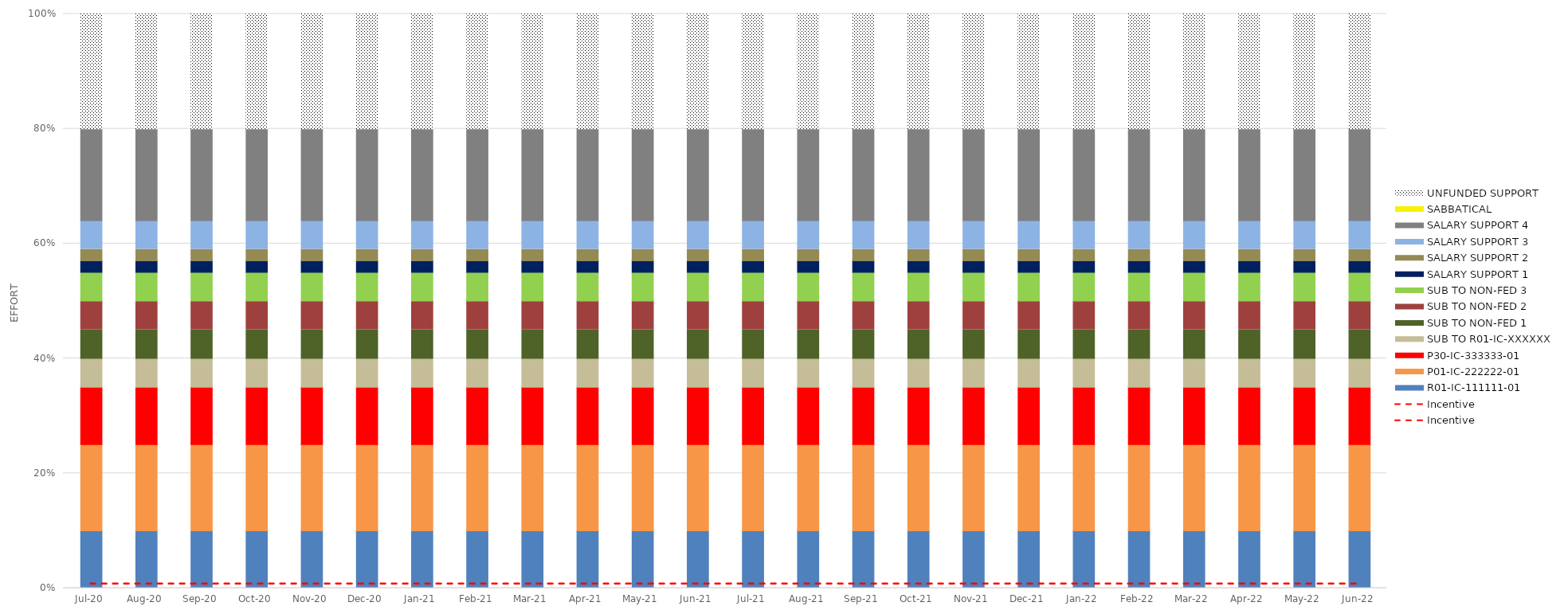
| Category | R01-IC-111111-01 | P01-IC-222222-01 | P30-IC-333333-01 | SUB TO R01-IC-XXXXXX | SUB TO NON-FED 1 | SUB TO NON-FED 2 | SUB TO NON-FED 3 | SALARY SUPPORT 1 | SALARY SUPPORT 2 | SALARY SUPPORT 3 | SALARY SUPPORT 4 | SABBATICAL | UNFUNDED SUPPORT |
|---|---|---|---|---|---|---|---|---|---|---|---|---|---|
| 2020-07-31 | 0.1 | 0.15 | 0.1 | 0.05 | 0.05 | 0.05 | 0.05 | 0.02 | 0.02 | 0.05 | 0.16 | 0 | 0.2 |
| 2020-08-31 | 0.1 | 0.15 | 0.1 | 0.05 | 0.05 | 0.05 | 0.05 | 0.02 | 0.02 | 0.05 | 0.16 | 0 | 0.2 |
| 2020-09-30 | 0.1 | 0.15 | 0.1 | 0.05 | 0.05 | 0.05 | 0.05 | 0.02 | 0.02 | 0.05 | 0.16 | 0 | 0.2 |
| 2020-10-31 | 0.1 | 0.15 | 0.1 | 0.05 | 0.05 | 0.05 | 0.05 | 0.02 | 0.02 | 0.05 | 0.16 | 0 | 0.2 |
| 2020-11-30 | 0.1 | 0.15 | 0.1 | 0.05 | 0.05 | 0.05 | 0.05 | 0.02 | 0.02 | 0.05 | 0.16 | 0 | 0.2 |
| 2020-12-31 | 0.1 | 0.15 | 0.1 | 0.05 | 0.05 | 0.05 | 0.05 | 0.02 | 0.02 | 0.05 | 0.16 | 0 | 0.2 |
| 2021-01-31 | 0.1 | 0.15 | 0.1 | 0.05 | 0.05 | 0.05 | 0.05 | 0.02 | 0.02 | 0.05 | 0.16 | 0 | 0.2 |
| 2021-02-28 | 0.1 | 0.15 | 0.1 | 0.05 | 0.05 | 0.05 | 0.05 | 0.02 | 0.02 | 0.05 | 0.16 | 0 | 0.2 |
| 2021-03-31 | 0.1 | 0.15 | 0.1 | 0.05 | 0.05 | 0.05 | 0.05 | 0.02 | 0.02 | 0.05 | 0.16 | 0 | 0.2 |
| 2021-04-30 | 0.1 | 0.15 | 0.1 | 0.05 | 0.05 | 0.05 | 0.05 | 0.02 | 0.02 | 0.05 | 0.16 | 0 | 0.2 |
| 2021-05-31 | 0.1 | 0.15 | 0.1 | 0.05 | 0.05 | 0.05 | 0.05 | 0.02 | 0.02 | 0.05 | 0.16 | 0 | 0.2 |
| 2021-06-30 | 0.1 | 0.15 | 0.1 | 0.05 | 0.05 | 0.05 | 0.05 | 0.02 | 0.02 | 0.05 | 0.16 | 0 | 0.2 |
| 2021-07-31 | 0.1 | 0.15 | 0.1 | 0.05 | 0.05 | 0.05 | 0.05 | 0.02 | 0.02 | 0.05 | 0.16 | 0 | 0.2 |
| 2021-08-31 | 0.1 | 0.15 | 0.1 | 0.05 | 0.05 | 0.05 | 0.05 | 0.02 | 0.02 | 0.05 | 0.16 | 0 | 0.2 |
| 2021-09-30 | 0.1 | 0.15 | 0.1 | 0.05 | 0.05 | 0.05 | 0.05 | 0.02 | 0.02 | 0.05 | 0.16 | 0 | 0.2 |
| 2021-10-31 | 0.1 | 0.15 | 0.1 | 0.05 | 0.05 | 0.05 | 0.05 | 0.02 | 0.02 | 0.05 | 0.16 | 0 | 0.2 |
| 2021-11-30 | 0.1 | 0.15 | 0.1 | 0.05 | 0.05 | 0.05 | 0.05 | 0.02 | 0.02 | 0.05 | 0.16 | 0 | 0.2 |
| 2021-12-31 | 0.1 | 0.15 | 0.1 | 0.05 | 0.05 | 0.05 | 0.05 | 0.02 | 0.02 | 0.05 | 0.16 | 0 | 0.2 |
| 2022-01-31 | 0.1 | 0.15 | 0.1 | 0.05 | 0.05 | 0.05 | 0.05 | 0.02 | 0.02 | 0.05 | 0.16 | 0 | 0.2 |
| 2022-02-28 | 0.1 | 0.15 | 0.1 | 0.05 | 0.05 | 0.05 | 0.05 | 0.02 | 0.02 | 0.05 | 0.16 | 0 | 0.2 |
| 2022-03-31 | 0.1 | 0.15 | 0.1 | 0.05 | 0.05 | 0.05 | 0.05 | 0.02 | 0.02 | 0.05 | 0.16 | 0 | 0.2 |
| 2022-04-30 | 0.1 | 0.15 | 0.1 | 0.05 | 0.05 | 0.05 | 0.05 | 0.02 | 0.02 | 0.05 | 0.16 | 0 | 0.2 |
| 2022-05-31 | 0.1 | 0.15 | 0.1 | 0.05 | 0.05 | 0.05 | 0.05 | 0.02 | 0.02 | 0.05 | 0.16 | 0 | 0.2 |
| 2022-06-30 | 0.1 | 0.15 | 0.1 | 0.05 | 0.05 | 0.05 | 0.05 | 0.02 | 0.02 | 0.05 | 0.16 | 0 | 0.2 |